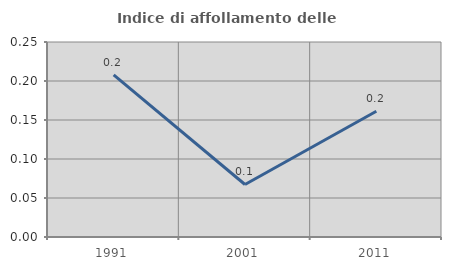
| Category | Indice di affollamento delle abitazioni  |
|---|---|
| 1991.0 | 0.208 |
| 2001.0 | 0.067 |
| 2011.0 | 0.161 |